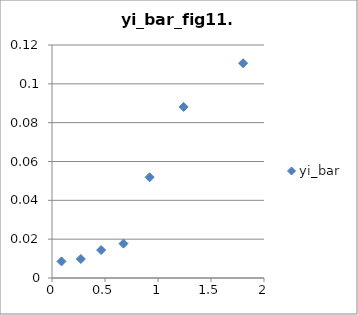
| Category | yi_bar |
|---|---|
| 1.8027430907391906 | 0.111 |
| 1.2418667918433204 | 0.088 |
| 0.4637077514571792 | 0.014 |
| 0.9208229763683794 | 0.052 |
| 0.08964235107576254 | 0.009 |
| 0.27188000539926077 | 0.01 |
| 0.6744897501960819 | 0.018 |